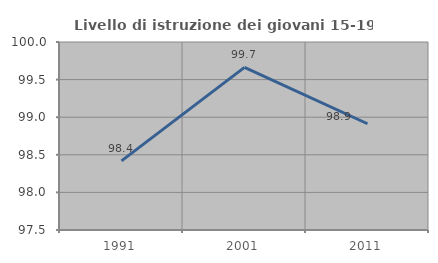
| Category | Livello di istruzione dei giovani 15-19 anni |
|---|---|
| 1991.0 | 98.419 |
| 2001.0 | 99.663 |
| 2011.0 | 98.913 |